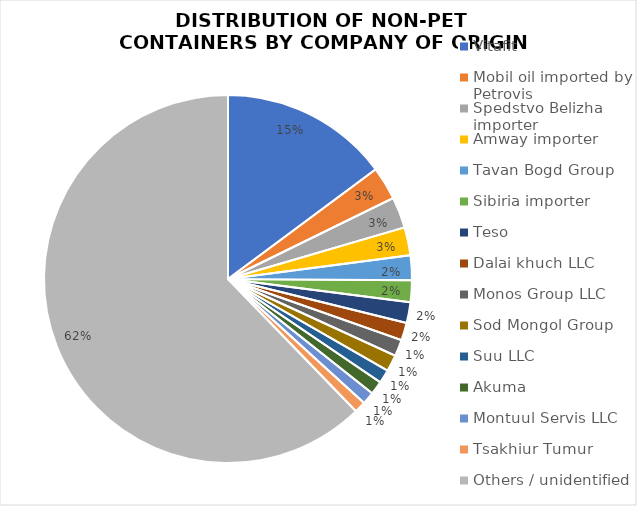
| Category | Series 1 |
|---|---|
| Vitafit | 163 |
| Mobil oil imported by Petrovis | 32 |
| Spedstvo Belizha importer | 30 |
| Amway importer | 27 |
| Tavan Bogd Group | 24 |
| Sibiria importer | 21 |
| Teso | 20 |
| Dalai khuch LLC | 17 |
| Monos Group LLC | 16 |
| Sod Mongol Group | 16 |
| Suu LLC | 13 |
| Akuma | 13 |
| Montuul Servis LLC | 12 |
| Tsakhiur Tumur | 11 |
| Others / unidentified | 684 |